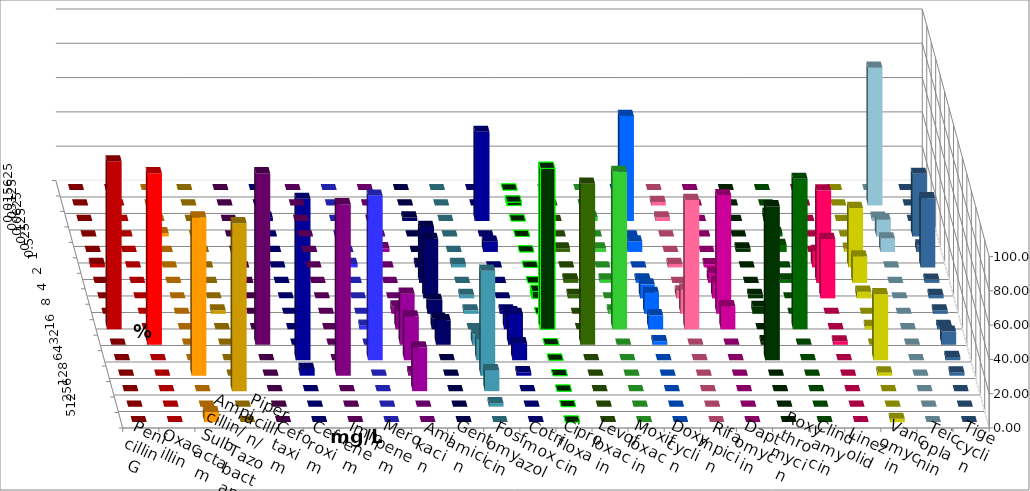
| Category | Penicillin G | Oxacillin | Ampicillin/ Sulbactam | Piperacillin/ Tazobactam | Cefotaxim | Cefuroxim | Imipenem | Meropenem | Amikacin | Gentamicin | Fosfomycin | Cotrimoxazol | Ciprofloxacin | Levofloxacin | Moxifloxacin | Doxycyclin | Rifampicin | Daptomycin | Roxythromycin | Clindamycin | Linezolid | Vancomycin | Teicoplanin | Tigecyclin |
|---|---|---|---|---|---|---|---|---|---|---|---|---|---|---|---|---|---|---|---|---|---|---|---|---|
| 0.015625 | 0 | 0 | 0 | 0 | 0 | 0 | 0 | 0 | 0 | 0 | 0 | 0 | 0 | 0 | 0 | 0 | 0 | 0 | 0 | 0 | 0 | 0 | 0 | 0 |
| 0.03125 | 0 | 0 | 0 | 0 | 0 | 0 | 0 | 0 | 0 | 0 | 0 | 0 | 2.041 | 0 | 0 | 0 | 2.041 | 0 | 0 | 0 | 0 | 0 | 0 | 80.392 |
| 0.0625 | 0 | 0 | 0 | 0 | 0 | 0 | 1.961 | 0 | 0 | 2.041 | 0 | 52 | 0 | 0 | 2.041 | 61.224 | 2.041 | 0 | 0 | 4.082 | 0 | 0 | 0 | 1.961 |
| 0.125 | 0 | 0 | 1.923 | 0 | 0 | 0 | 0 | 0 | 0 | 0 | 0 | 0 | 0 | 0 | 0 | 0 | 0 | 0 | 0 | 2.041 | 0 | 0 | 36.538 | 9.804 |
| 0.25 | 0 | 0 | 0 | 0 | 0 | 0 | 0 | 0 | 2.128 | 0 | 0 | 6 | 0 | 2.041 | 2.041 | 6.122 | 0 | 0 | 2.041 | 4.082 | 0 | 1.923 | 3.846 | 7.843 |
| 0.5 | 2.041 | 0 | 0 | 0 | 0 | 0 | 0 | 2.041 | 0 | 2.041 | 2.041 | 0 | 0 | 0 | 0 | 0 | 2.041 | 1.923 | 0 | 0 | 9.615 | 34.615 | 40.385 | 0 |
| 1.0 | 0 | 0 | 0 | 0 | 0 | 0 | 0 | 0 | 0 | 32.653 | 0 | 0 | 0 | 2.041 | 2.041 | 2.041 | 0 | 5.769 | 0 | 2.041 | 53.846 | 15.385 | 1.923 | 0 |
| 2.0 | 0 | 0 | 0 | 0 | 0 | 0 | 0 | 0 | 0 | 34.694 | 2.041 | 0 | 4.082 | 2.041 | 0 | 8.163 | 4.082 | 9.615 | 2.041 | 0 | 34.615 | 3.846 | 1.923 | 0 |
| 4.0 | 0 | 0 | 0 | 2.041 | 0 | 0 | 0 | 0 | 4.255 | 8.163 | 2.041 | 2 | 0 | 0 | 2.041 | 12.245 | 14.286 | 69.231 | 4.082 | 0 | 0 | 0 | 1.923 | 0 |
| 8.0 | 97.959 | 0 | 0 | 0 | 0 | 0 | 0 | 2.041 | 10.638 | 6.122 | 0 | 10 | 93.878 | 0 | 91.837 | 8.163 | 75.51 | 13.462 | 0 | 87.755 | 0 | 1.923 | 1.923 | 0 |
| 16.0 | 0 | 100 | 0 | 0 | 100 | 0 | 0 | 0 | 29.787 | 14.286 | 6.122 | 18 | 0 | 93.878 | 0 | 2.041 | 0 | 0 | 2.041 | 0 | 1.923 | 0 | 7.692 | 0 |
| 32.0 | 0 | 0 | 0 | 0 | 0 | 0 | 94.118 | 95.918 | 25.532 | 0 | 12.245 | 10 | 0 | 0 | 0 | 0 | 0 | 0 | 89.796 | 0 | 0 | 38.462 | 1.923 | 0 |
| 64.0 | 0 | 0 | 92.308 | 0 | 0 | 100 | 3.922 | 0 | 2.128 | 0 | 61.224 | 2 | 0 | 0 | 0 | 0 | 0 | 0 | 0 | 0 | 0 | 1.923 | 1.923 | 0 |
| 128.0 | 0 | 0 | 0 | 97.959 | 0 | 0 | 0 | 0 | 25.532 | 0 | 12.245 | 0 | 0 | 0 | 0 | 0 | 0 | 0 | 0 | 0 | 0 | 0 | 0 | 0 |
| 256.0 | 0 | 0 | 0 | 0 | 0 | 0 | 0 | 0 | 0 | 0 | 2.041 | 0 | 0 | 0 | 0 | 0 | 0 | 0 | 0 | 0 | 0 | 0 | 0 | 0 |
| 512.0 | 0 | 0 | 5.769 | 0 | 0 | 0 | 0 | 0 | 0 | 0 | 0 | 0 | 0 | 0 | 0 | 0 | 0 | 0 | 0 | 0 | 0 | 1.923 | 0 | 0 |